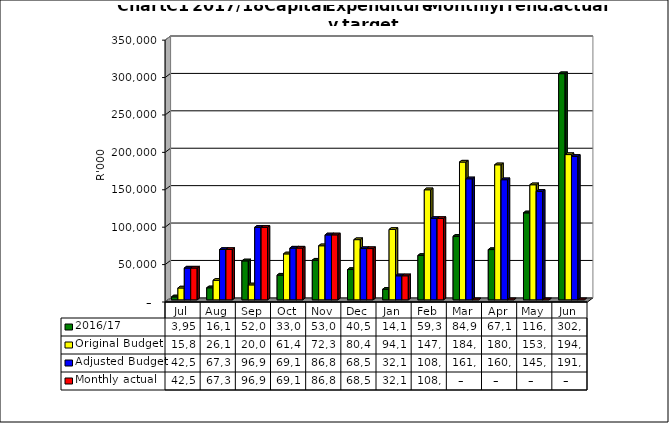
| Category | 2016/17 | Original Budget | Adjusted Budget | Monthly actual |
|---|---|---|---|---|
| Jul | 3958013.321 | 15888227.121 | 42514077.958 | 42514077.958 |
| Aug | 16119878.958 | 26147045.201 | 67305085.712 | 67305085.712 |
| Sep | 52071773.847 | 20000000 | 96927101.019 | 96927101.019 |
| Oct | 33023091.668 | 61424090.403 | 69191121.856 | 69191121.856 |
| Nov | 53074277.766 | 72300520.141 | 86835890.219 | 86835890.219 |
| Dec | 40503251.183 | 80450520.141 | 68525464.005 | 68525464.005 |
| Jan | 14140244.7 | 94117062.52 | 32153725.45 | 32153725.45 |
| Feb | 59318767.097 | 147118047.537 | 108760288.608 | 108760288.608 |
| Mar | 84955280.367 | 184167062.52 | 161756536.771 | 0 |
| Apr | 67166855.65 | 180519809.357 | 160571171.21 | 0 |
| May | 116269357.366 | 153826239.095 | 145082000 | 0 |
| Jun | 302312762.406 | 194159375.962 | 191756536.771 | 0 |